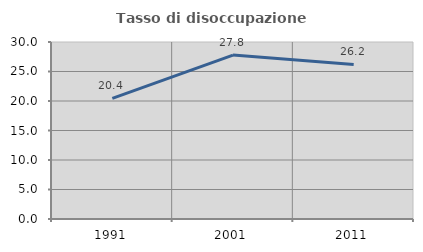
| Category | Tasso di disoccupazione giovanile  |
|---|---|
| 1991.0 | 20.43 |
| 2001.0 | 27.778 |
| 2011.0 | 26.19 |